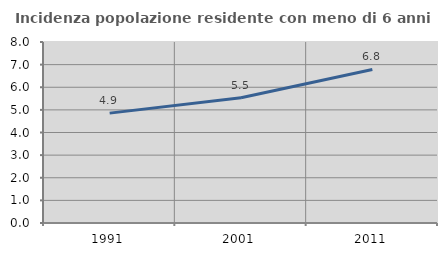
| Category | Incidenza popolazione residente con meno di 6 anni |
|---|---|
| 1991.0 | 4.857 |
| 2001.0 | 5.537 |
| 2011.0 | 6.785 |